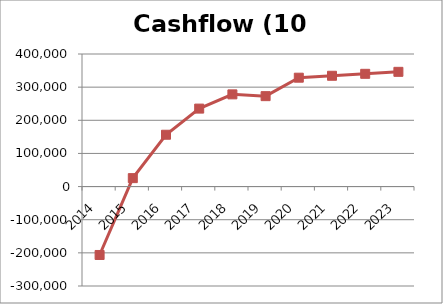
| Category | Series 1 |
|---|---|
| 2014.0 | -206400 |
| 2015.0 | 25468 |
| 2016.0 | 156404.44 |
| 2017.0 | 235256.285 |
| 2018.0 | 278225.252 |
| 2019.0 | 272811.839 |
| 2020.0 | 328521.503 |
| 2021.0 | 334322.963 |
| 2022.0 | 340217.384 |
| 2023.0 | 346205.932 |